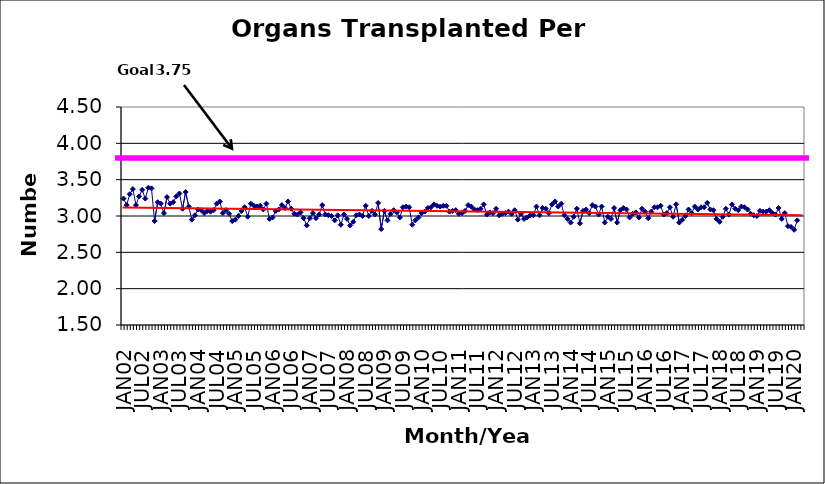
| Category | Series 0 |
|---|---|
| JAN02 | 3.24 |
| FEB02 | 3.15 |
| MAR02 | 3.3 |
| APR02 | 3.37 |
| MAY02 | 3.15 |
| JUN02 | 3.27 |
| JUL02 | 3.36 |
| AUG02 | 3.24 |
| SEP02 | 3.39 |
| OCT02 | 3.38 |
| NOV02 | 2.93 |
| DEC02 | 3.19 |
| JAN03 | 3.17 |
| FEB03 | 3.04 |
| MAR03 | 3.26 |
| APR03 | 3.17 |
| MAY03 | 3.19 |
| JUN03 | 3.27 |
| JUL03 | 3.31 |
| AUG03 | 3.1 |
| SEP03 | 3.33 |
| OCT03 | 3.13 |
| NOV03 | 2.95 |
| DEC03 | 3.01 |
| JAN04 | 3.09 |
| FEB04 | 3.08 |
| MAR04 | 3.04 |
| APR04 | 3.07 |
| MAY04 | 3.06 |
| JUN04 | 3.08 |
| JUL04 | 3.17 |
| AUG04 | 3.2 |
| SEP04 | 3.04 |
| OCT04 | 3.08 |
| NOV04 | 3.03 |
| DEC04 | 2.93 |
| JAN05 | 2.95 |
| FEB05 | 3 |
| MAR05 | 3.07 |
| APR05 | 3.12 |
| MAY05 | 2.99 |
| JUN05 | 3.17 |
| JUL05 | 3.14 |
| AUG05 | 3.13 |
| SEP05 | 3.14 |
| OCT05 | 3.09 |
| NOV05 | 3.17 |
| DEC05 | 2.96 |
| JAN06 | 2.98 |
| FEB06 | 3.07 |
| MAR06 | 3.09 |
| APR06 | 3.15 |
| MAY06 | 3.11 |
| JUN06 | 3.2 |
| JUL06 | 3.1 |
| AUG06 | 3.03 |
| SEP06 | 3.02 |
| OCT06 | 3.05 |
| NOV06 | 2.97 |
| DEC06 | 2.87 |
| JAN07 | 2.97 |
| FEB07 | 3.04 |
| MAR07 | 2.97 |
| APR07 | 3.02 |
| MAY07 | 3.15 |
| JUN07 | 3.02 |
| JUL07 | 3.01 |
| AUG07 | 3 |
| SEP07 | 2.94 |
| OCT07 | 3.01 |
| NOV07 | 2.88 |
| DEC07 | 3.02 |
| JAN08 | 2.96 |
| FEB08 | 2.87 |
| MAR08 | 2.92 |
| APR08 | 3.01 |
| MAY08 | 3.02 |
| JUN08 | 3 |
| JUL08 | 3.14 |
| AUG08 | 3 |
| SEP08 | 3.07 |
| OCT08 | 3.02 |
| NOV08 | 3.18 |
| DEC08 | 2.82 |
| JAN09 | 3.07 |
| FEB09 | 2.94 |
| MAR09 | 3.03 |
| APR09 | 3.08 |
| MAY09 | 3.05 |
| JUN09 | 2.98 |
| JUL09 | 3.12 |
| AUG09 | 3.13 |
| SEP09 | 3.12 |
| OCT09 | 2.88 |
| NOV09 | 2.94 |
| DEC09 | 2.98 |
| JAN10 | 3.04 |
| FEB10 | 3.06 |
| MAR10 | 3.11 |
| APR10 | 3.12 |
| MAY10 | 3.16 |
| JUN10 | 3.14 |
| JUL10 | 3.13 |
| AUG10 | 3.14 |
| SEP10 | 3.14 |
| OCT10 | 3.06 |
| NOV10 | 3.07 |
| DEC10 | 3.08 |
| JAN11 | 3.03 |
| FEB11 | 3.04 |
| MAR11 | 3.07 |
| APR11 | 3.15 |
| MAY11 | 3.13 |
| JUN11 | 3.09 |
| JUL11 | 3.08 |
| AUG11 | 3.1 |
| SEP11 | 3.16 |
| OCT11 | 3.02 |
| NOV11 | 3.05 |
| DEC11 | 3.04 |
| JAN12 | 3.1 |
| FEB12 | 3.01 |
| MAR12 | 3.03 |
| APR12 | 3.04 |
| MAY12 | 3.06 |
| JUN12 | 3.03 |
| JUL12 | 3.08 |
| AUG12 | 2.95 |
| SEP12 | 3.03 |
| OCT12 | 2.96 |
| NOV12 | 2.98 |
| DEC12 | 3.01 |
| JAN13 | 3.01 |
| FEB13 | 3.13 |
| MAR13 | 3.01 |
| APR13 | 3.11 |
| MAY13 | 3.1 |
| JUN13 | 3.04 |
| JUL13 | 3.16 |
| AUG13 | 3.2 |
| SEP13 | 3.13 |
| OCT13 | 3.17 |
| NOV13 | 3.01 |
| DEC13 | 2.96 |
| JAN14 | 2.91 |
| FEB14 | 2.99 |
| MAR14 | 3.1 |
| APR14 | 2.9 |
| MAY14 | 3.07 |
| JUN14 | 3.09 |
| JUL14 | 3.04 |
| AUG14 | 3.15 |
| SEP14 | 3.13 |
| OCT14 | 3.02 |
| NOV14 | 3.13 |
| DEC14 | 2.91 |
| JAN15 | 2.99 |
| FEB15 | 2.96 |
| MAR15 | 3.11 |
| APR15 | 2.91 |
| MAY15 | 3.08 |
| JUN15 | 3.11 |
| JUL15 | 3.09 |
| AUG15 | 2.98 |
| SEP15 | 3.03 |
| OCT15 | 3.05 |
| NOV15 | 2.98 |
| DEC15 | 3.1 |
| JAN16 | 3.06 |
| FEB16 | 2.97 |
| MAR16 | 3.06 |
| APR16 | 3.12 |
| MAY16 | 3.12 |
| JUN16 | 3.14 |
| JUL16 | 3.02 |
| AUG16 | 3.04 |
| SEP16 | 3.12 |
| OCT16 | 2.99 |
| NOV16 | 3.16 |
| DEC16 | 2.91 |
| JAN17 | 2.95 |
| FEB17 | 3 |
| MAR17 | 3.09 |
| APR17 | 3.04 |
| MAY17 | 3.13 |
| JUN17 | 3.09 |
| JUL17 | 3.12 |
| AUG17 | 3.12 |
| SEP17 | 3.18 |
| OCT17 | 3.09 |
| NOV17 | 3.08 |
| DEC17 | 2.96 |
| JAN18 | 2.92 |
| FEB18 | 2.99 |
| MAR18 | 3.1 |
| APR18 | 3.02 |
| MAY18 | 3.16 |
| JUN18 | 3.1 |
| JUL18 | 3.08 |
| AUG18 | 3.13 |
| SEP18 | 3.12 |
| OCT18 | 3.09 |
| NOV18 | 3.03 |
| DEC18 | 3.01 |
| JAN19 | 3 |
| FEB19 | 3.07 |
| MAR19 | 3.06 |
| APR19 | 3.06 |
| MAY19 | 3.08 |
| JUN19 | 3.04 |
| JUL19 | 3.02 |
| AUG19 | 3.11 |
| SEP19 | 2.96 |
| OCT19 | 3.04 |
| NOV19 | 2.86 |
| DEC19 | 2.85 |
| JAN20 | 2.81 |
| FEB20 | 2.94 |